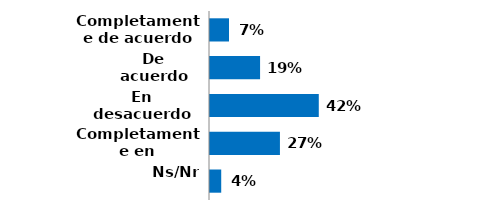
| Category | Series 0 |
|---|---|
| Completamente de acuerdo | 0.073 |
| De acuerdo | 0.193 |
| En desacuerdo | 0.42 |
| Completamente en desacuerdo | 0.27 |
| Ns/Nr | 0.043 |